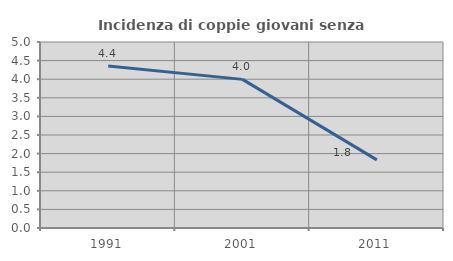
| Category | Incidenza di coppie giovani senza figli |
|---|---|
| 1991.0 | 4.353 |
| 2001.0 | 3.995 |
| 2011.0 | 1.831 |